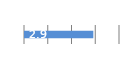
| Category | Series 0 |
|---|---|
| 0 | 2.919 |